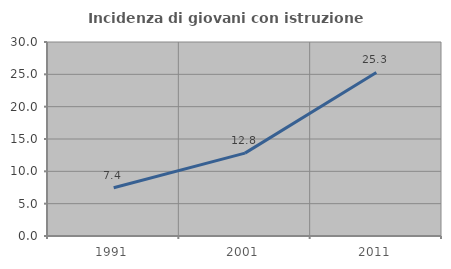
| Category | Incidenza di giovani con istruzione universitaria |
|---|---|
| 1991.0 | 7.45 |
| 2001.0 | 12.812 |
| 2011.0 | 25.284 |